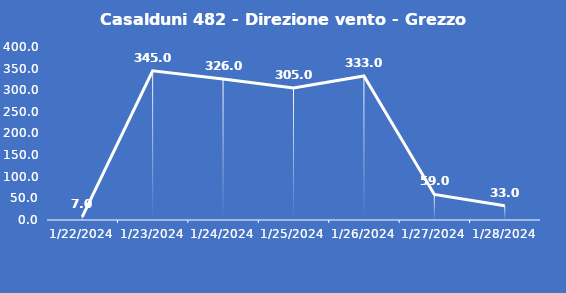
| Category | Casalduni 482 - Direzione vento - Grezzo (°N) |
|---|---|
| 1/22/24 | 7 |
| 1/23/24 | 345 |
| 1/24/24 | 326 |
| 1/25/24 | 305 |
| 1/26/24 | 333 |
| 1/27/24 | 59 |
| 1/28/24 | 33 |